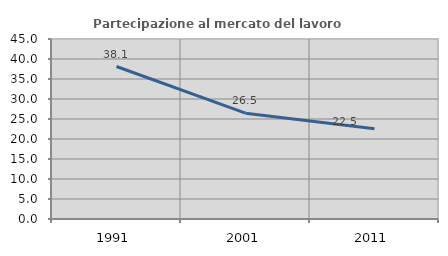
| Category | Partecipazione al mercato del lavoro  femminile |
|---|---|
| 1991.0 | 38.117 |
| 2001.0 | 26.458 |
| 2011.0 | 22.541 |